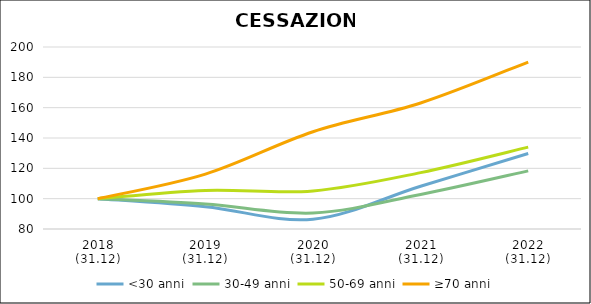
| Category | <30 anni | 30-49 anni | 50-69 anni | ≥70 anni |
|---|---|---|---|---|
| 2018
(31.12) | 100 | 100 | 100 | 100 |
| 2019
(31.12) | 94.668 | 96.476 | 105.448 | 116.216 |
| 2020
(31.12) | 86.41 | 90.547 | 105.123 | 144.144 |
| 2021
(31.12) | 108.192 | 102.774 | 117.167 | 163.063 |
| 2022
(31.12) | 129.817 | 118.303 | 133.961 | 190.09 |